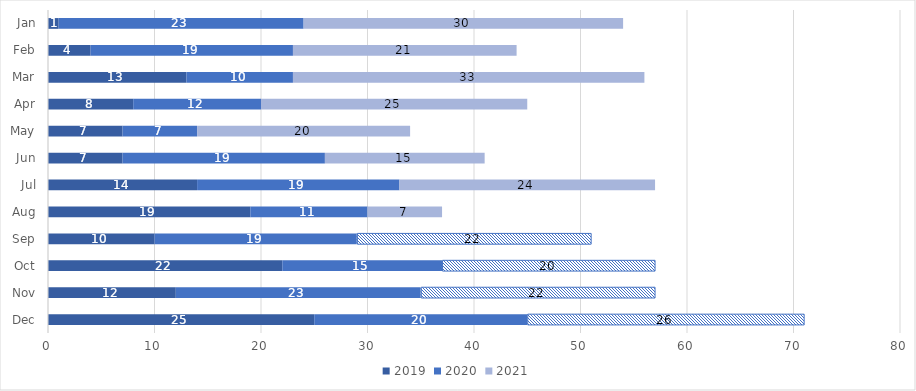
| Category | 2019 | 2020 | 2021 |
|---|---|---|---|
| Dec | 25 | 20 | 26 |
| Nov | 12 | 23 | 22 |
| Oct | 22 | 15 | 20 |
| Sep | 10 | 19 | 22 |
| Aug | 19 | 11 | 7 |
| Jul | 14 | 19 | 24 |
| Jun | 7 | 19 | 15 |
| May | 7 | 7 | 20 |
| Apr | 8 | 12 | 25 |
| Mar | 13 | 10 | 33 |
| Feb | 4 | 19 | 21 |
| Jan | 1 | 23 | 30 |